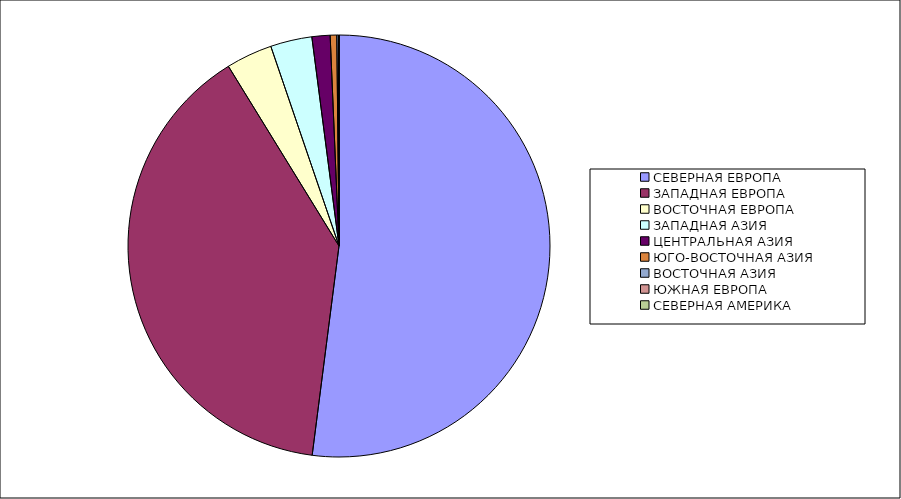
| Category | Оборот |
|---|---|
| СЕВЕРНАЯ ЕВРОПА | 52.03 |
| ЗАПАДНАЯ ЕВРОПА | 39.189 |
| ВОСТОЧНАЯ ЕВРОПА | 3.543 |
| ЗАПАДНАЯ АЗИЯ | 3.181 |
| ЦЕНТРАЛЬНАЯ АЗИЯ | 1.388 |
| ЮГО-ВОСТОЧНАЯ АЗИЯ | 0.504 |
| ВОСТОЧНАЯ АЗИЯ | 0.144 |
| ЮЖНАЯ ЕВРОПА | 0.02 |
| СЕВЕРНАЯ АМЕРИКА | 0.001 |